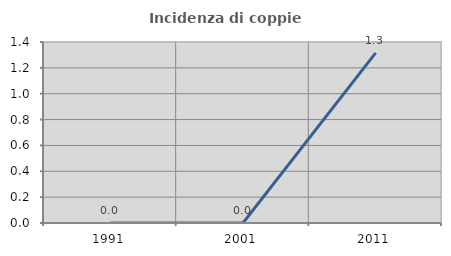
| Category | Incidenza di coppie miste |
|---|---|
| 1991.0 | 0 |
| 2001.0 | 0 |
| 2011.0 | 1.316 |